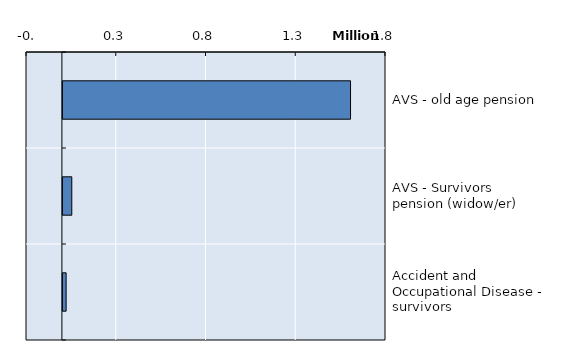
| Category | Series 0 |
|---|---|
| AVS - old age pension | 1602415 |
| AVS - Survivors pension (widow/er) | 49534 |
| Accident and Occupational Disease - survivors | 17999 |